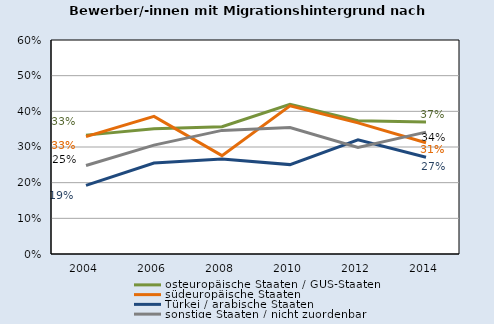
| Category | osteuropäische Staaten / GUS-Staaten | südeuropäische Staaten | Türkei / arabische Staaten | sonstige Staaten / nicht zuordenbar |
|---|---|---|---|---|
| 2004.0 | 0.333 | 0.329 | 0.193 | 0.248 |
| 2006.0 | 0.351 | 0.386 | 0.255 | 0.305 |
| 2008.0 | 0.357 | 0.276 | 0.266 | 0.347 |
| 2010.0 | 0.42 | 0.415 | 0.251 | 0.355 |
| 2012.0 | 0.374 | 0.368 | 0.32 | 0.299 |
| 2014.0 | 0.37 | 0.312 | 0.271 | 0.342 |